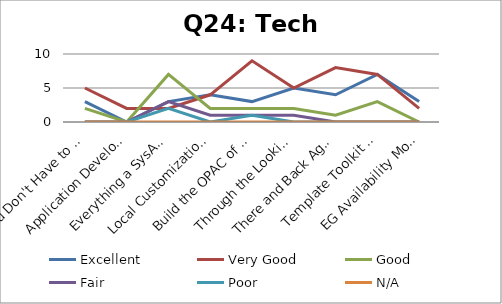
| Category | Excellent | Very Good | Good | Fair | Poor | N/A |
|---|---|---|---|---|---|---|
| You Don't Have to be a Mechanic | 3 | 5 | 2 | 0 | 0 | 0 |
| Application Development | 0 | 2 | 0 | 0 | 0 | 0 |
| Everything a SysAdmin | 3 | 2 | 7 | 3 | 2 | 0 |
| Local Customizations | 4 | 4 | 2 | 1 | 0 | 0 |
| Build the OPAC of your Dreams | 3 | 9 | 2 | 1 | 1 | 0 |
| Through the Looking Glass (Part 2) | 5 | 5 | 2 | 1 | 0 | 0 |
| There and Back Again | 4 | 8 | 1 | 0 | 0 | 0 |
| Template Toolkit OPAC  | 7 | 7 | 3 | 0 | 0 | 0 |
| EG Availability Monitoring | 3 | 2 | 0 | 0 | 0 | 0 |